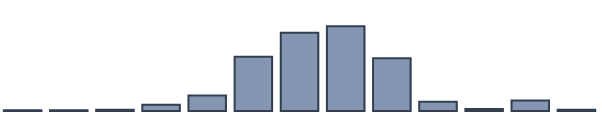
| Category | Series 0 |
|---|---|
| 0 | 0.2 |
| 1 | 0.2 |
| 2 | 0.4 |
| 3 | 2 |
| 4 | 4.9 |
| 5 | 17.1 |
| 6 | 24.7 |
| 7 | 26.7 |
| 8 | 16.6 |
| 9 | 2.9 |
| 10 | 0.6 |
| 11 | 3.3 |
| 12 | 0.4 |